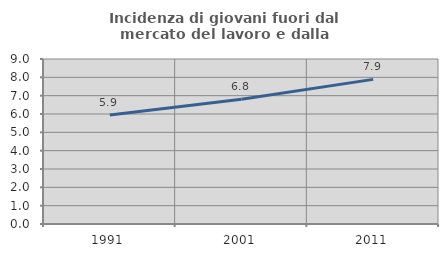
| Category | Incidenza di giovani fuori dal mercato del lavoro e dalla formazione  |
|---|---|
| 1991.0 | 5.944 |
| 2001.0 | 6.8 |
| 2011.0 | 7.889 |